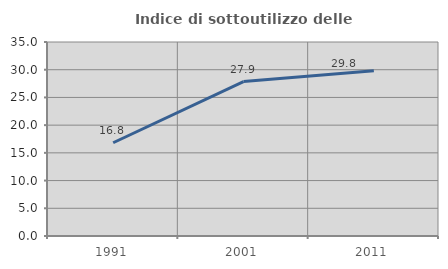
| Category | Indice di sottoutilizzo delle abitazioni  |
|---|---|
| 1991.0 | 16.825 |
| 2001.0 | 27.855 |
| 2011.0 | 29.833 |